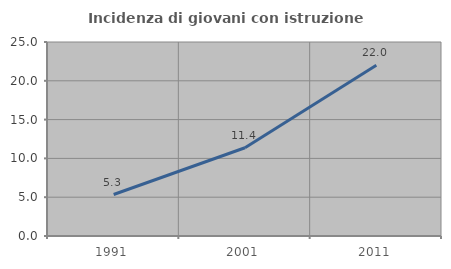
| Category | Incidenza di giovani con istruzione universitaria |
|---|---|
| 1991.0 | 5.346 |
| 2001.0 | 11.37 |
| 2011.0 | 21.993 |